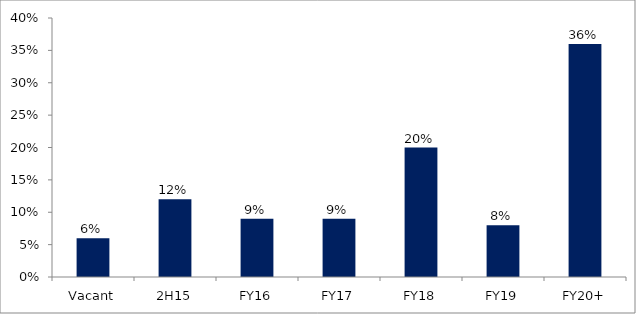
| Category | Series 0 |
|---|---|
| Vacant | 0.06 |
| 2H15 | 0.12 |
| FY16 | 0.09 |
| FY17 | 0.09 |
| FY18 | 0.2 |
| FY19 | 0.08 |
| FY20+ | 0.36 |